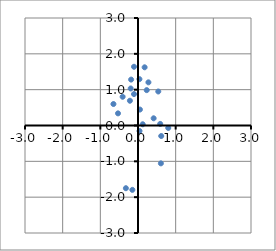
| Category | Series 0 |
|---|---|
| 0.5897791172539892 | 0.044 |
| 0.2767355408853809 | 1.205 |
| 0.5383387743609006 | 0.949 |
| -0.18269163626614254 | 1.281 |
| -0.19393190890574913 | 1.033 |
| 0.05089039306274351 | 0.445 |
| 0.17607357480552874 | 1.624 |
| -0.21454410378890906 | 0.691 |
| -0.48383573876862973 | -5.745 |
| 0.8029568913017581 | -0.068 |
| -0.3214897780165869 | -1.75 |
| -0.5307321579086322 | 0.339 |
| 0.2318066423264545 | 0.987 |
| 0.4154041008326578 | 0.201 |
| 0.03995844955449478 | -0.153 |
| 0.6076341818740236 | -1.056 |
| -0.10606636458261554 | 0.877 |
| -0.4077959990806097 | 0.802 |
| -0.10619347024936901 | 1.639 |
| -0.14997604760319042 | -1.796 |
| -0.6518029369401608 | 0.599 |
| -1.1605035575171052 | -3.183 |
| 0.1249104056505001 | 0.034 |
| 0.6171349111091589 | -0.293 |
| 0.03794071661010978 | 1.294 |